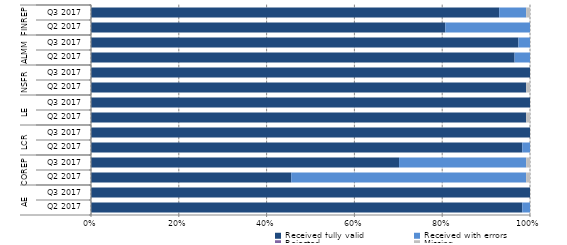
| Category | Received fully valid | Received with errors | Rejected | Missing |
|---|---|---|---|---|
| 0 | 112 | 2 | 0 | 0 |
| 1 | 114 | 0 | 0 | 0 |
| 2 | 52 | 61 | 0 | 1 |
| 3 | 80 | 33 | 0 | 1 |
| 4 | 112 | 2 | 0 | 0 |
| 5 | 114 | 0 | 0 | 0 |
| 6 | 113 | 0 | 0 | 1 |
| 7 | 114 | 0 | 0 | 0 |
| 8 | 113 | 0 | 0 | 1 |
| 9 | 114 | 0 | 0 | 0 |
| 10 | 110 | 4 | 0 | 0 |
| 11 | 111 | 3 | 0 | 0 |
| 12 | 92 | 22 | 0 | 0 |
| 13 | 106 | 7 | 0 | 1 |